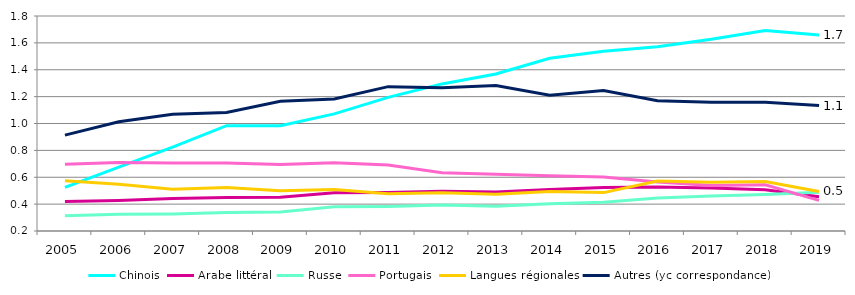
| Category | Chinois | Arabe littéral | Russe | Portugais | Langues régionales | Autres (yc correspondance) |
|---|---|---|---|---|---|---|
| 2005 | 0.525 | 0.419 | 0.313 | 0.697 | 0.575 | 0.914 |
| 2006 | 0.675 | 0.427 | 0.325 | 0.71 | 0.547 | 1.013 |
| 2007 | 0.825 | 0.442 | 0.327 | 0.707 | 0.51 | 1.068 |
| 2008 | 0.983 | 0.45 | 0.337 | 0.706 | 0.524 | 1.082 |
| 2009 | 0.983 | 0.451 | 0.341 | 0.695 | 0.5 | 1.165 |
| 2010 | 1.071 | 0.484 | 0.381 | 0.709 | 0.508 | 1.182 |
| 2011 | 1.194 | 0.487 | 0.383 | 0.69 | 0.477 | 1.274 |
| 2012 | 1.295 | 0.495 | 0.393 | 0.634 | 0.485 | 1.266 |
| 2013 | 1.369 | 0.491 | 0.384 | 0.623 | 0.474 | 1.283 |
| 2014 | 1.485 | 0.508 | 0.403 | 0.612 | 0.494 | 1.21 |
| 2015 | 1.538 | 0.524 | 0.413 | 0.602 | 0.486 | 1.245 |
| 2016 | 1.571 | 0.528 | 0.446 | 0.565 | 0.572 | 1.169 |
| 2017 | 1.626 | 0.521 | 0.46 | 0.539 | 0.564 | 1.158 |
| 2018 | 1.693 | 0.507 | 0.472 | 0.544 | 0.568 | 1.158 |
| 2019 | 1.658 | 0.454 | 0.488 | 0.428 | 0.494 | 1.133 |